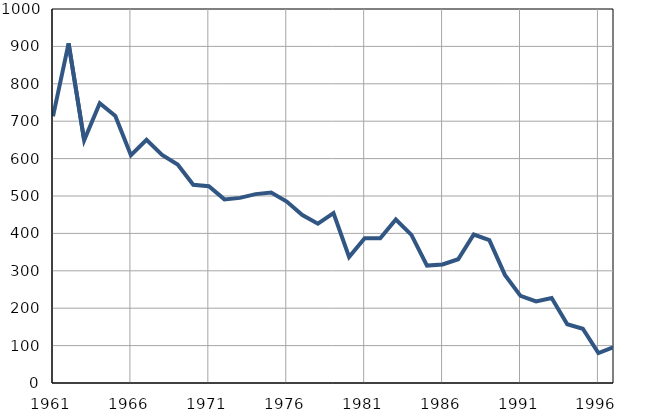
| Category | Умрла 
одојчад |
|---|---|
| 1961.0 | 713 |
| 1962.0 | 908 |
| 1963.0 | 649 |
| 1964.0 | 748 |
| 1965.0 | 714 |
| 1966.0 | 609 |
| 1967.0 | 650 |
| 1968.0 | 610 |
| 1969.0 | 584 |
| 1970.0 | 530 |
| 1971.0 | 526 |
| 1972.0 | 491 |
| 1973.0 | 495 |
| 1974.0 | 505 |
| 1975.0 | 509 |
| 1976.0 | 485 |
| 1977.0 | 449 |
| 1978.0 | 426 |
| 1979.0 | 454 |
| 1980.0 | 337 |
| 1981.0 | 387 |
| 1982.0 | 387 |
| 1983.0 | 437 |
| 1984.0 | 396 |
| 1985.0 | 314 |
| 1986.0 | 317 |
| 1987.0 | 331 |
| 1988.0 | 397 |
| 1989.0 | 382 |
| 1990.0 | 289 |
| 1991.0 | 233 |
| 1992.0 | 218 |
| 1993.0 | 227 |
| 1994.0 | 157 |
| 1995.0 | 145 |
| 1996.0 | 80 |
| 1997.0 | 96 |